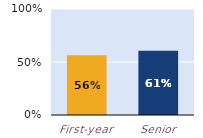
| Category | substantially |
|---|---|
| First-year | 0.565 |
| Senior | 0.607 |